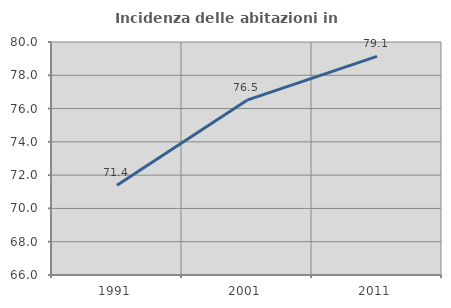
| Category | Incidenza delle abitazioni in proprietà  |
|---|---|
| 1991.0 | 71.39 |
| 2001.0 | 76.503 |
| 2011.0 | 79.136 |